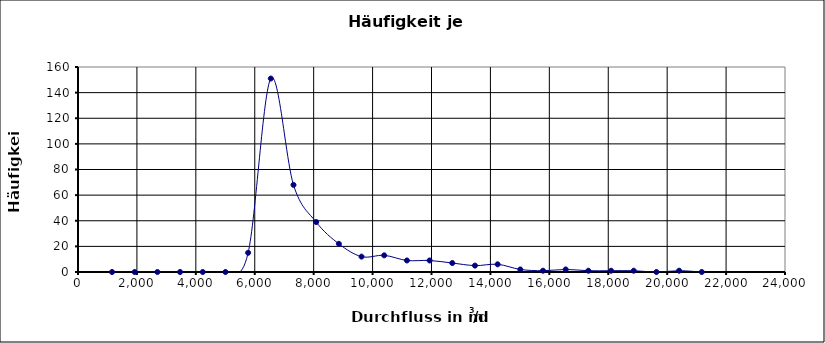
| Category | Häufigkeit |
|---|---|
| nan | 0 |
| 1155.0 | 0 |
| 1925.0 | 0 |
| 2695.0 | 0 |
| 3465.0 | 0 |
| 4235.0 | 0 |
| 5005.0 | 0 |
| 5775.0 | 15 |
| 6545.0 | 151 |
| 7315.0 | 68 |
| 8085.0 | 39 |
| 8855.0 | 22 |
| 9625.0 | 12 |
| 10395.0 | 13 |
| 11165.0 | 9 |
| 11935.0 | 9 |
| 12705.0 | 7 |
| 13475.0 | 5 |
| 14245.0 | 6 |
| 15015.0 | 2 |
| 15785.0 | 1 |
| 16555.0 | 2 |
| 17325.0 | 1 |
| 18095.0 | 1 |
| 18865.0 | 1 |
| 19635.0 | 0 |
| 20405.0 | 1 |
| 21175.0 | 0 |